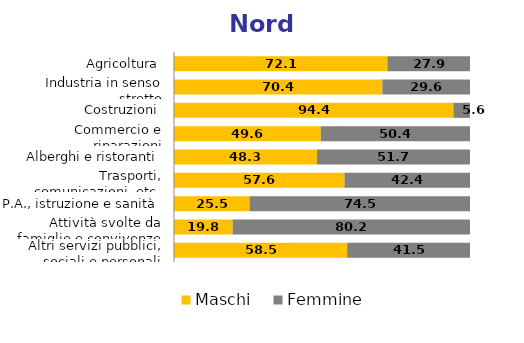
| Category | Maschi | Femmine |
|---|---|---|
| Agricoltura | 72.1 | 27.9 |
| Industria in senso stretto | 70.4 | 29.6 |
| Costruzioni | 94.4 | 5.6 |
| Commercio e riparazioni | 49.6 | 50.4 |
| Alberghi e ristoranti | 48.3 | 51.7 |
| Trasporti, comunicazioni, etc. | 57.6 | 42.4 |
| P.A., istruzione e sanità | 25.5 | 74.5 |
| Attività svolte da famiglie e convivenze | 19.8 | 80.2 |
| Altri servizi pubblici, sociali e personali | 58.5 | 41.5 |